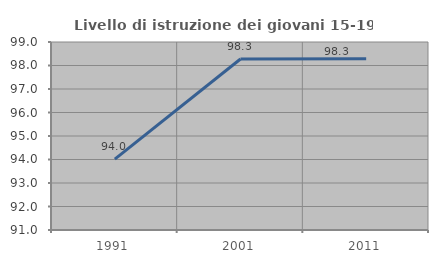
| Category | Livello di istruzione dei giovani 15-19 anni |
|---|---|
| 1991.0 | 94.014 |
| 2001.0 | 98.277 |
| 2011.0 | 98.282 |